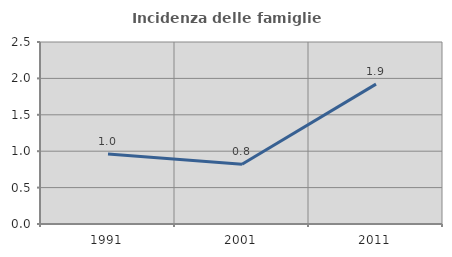
| Category | Incidenza delle famiglie numerose |
|---|---|
| 1991.0 | 0.963 |
| 2001.0 | 0.821 |
| 2011.0 | 1.921 |